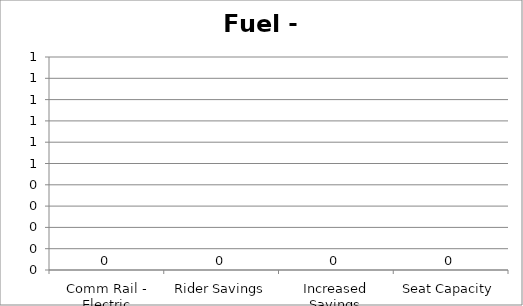
| Category | Fuel - GGE |
|---|---|
| Comm Rail - Electric | 0 |
| Rider Savings | 0 |
| Increased Savings | 0 |
| Seat Capacity | 0 |